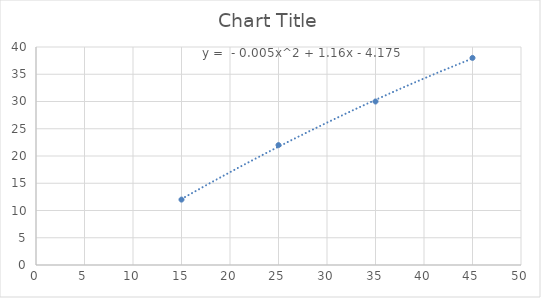
| Category | Series 0 |
|---|---|
| 15.0 | 12 |
| 25.0 | 22 |
| 35.0 | 30 |
| 45.0 | 38 |